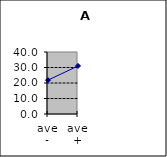
| Category | Series 0 |
|---|---|
| ave - | 21.833 |
| ave + | 31 |